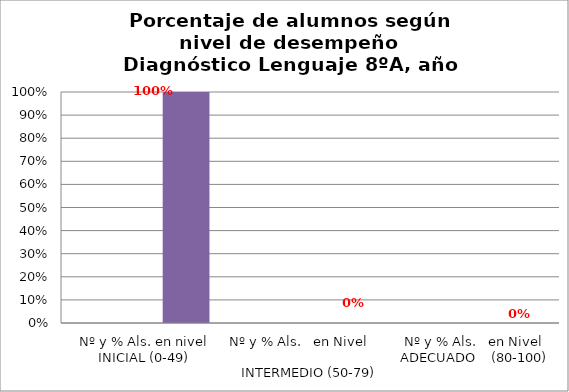
| Category | Series 0 | Series 1 | Series 2 | Series 3 |
|---|---|---|---|---|
| Nº y % Als. en nivel INICIAL (0-49) |  |  |  | 1 |
| Nº y % Als.   en Nivel                                          INTERMEDIO (50-79) |  |  |  | 0 |
| Nº y % Als.   en Nivel  ADECUADO    (80-100) |  |  |  | 0 |